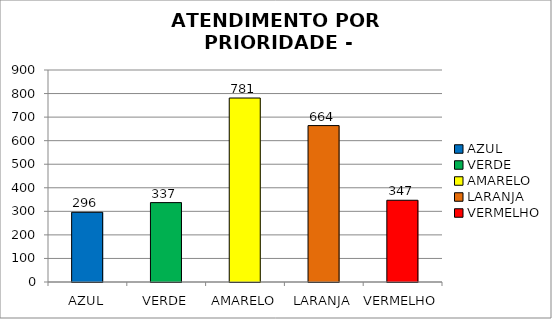
| Category | Total Regional: |
|---|---|
| AZUL | 296 |
| VERDE | 337 |
| AMARELO | 781 |
| LARANJA | 664 |
| VERMELHO | 347 |